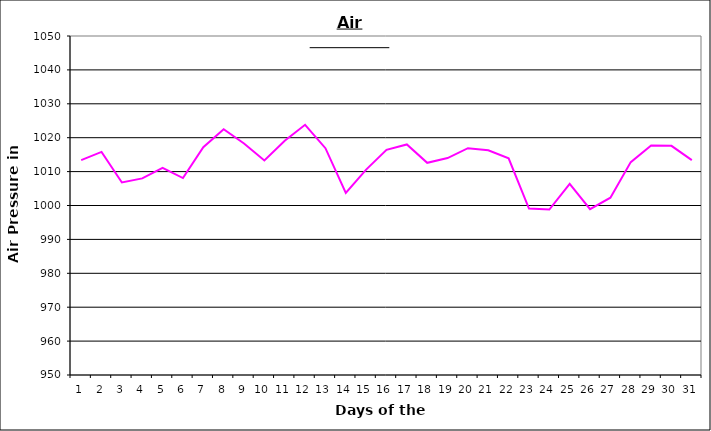
| Category | Series 0 |
|---|---|
| 0 | 1013.4 |
| 1 | 1015.8 |
| 2 | 1006.8 |
| 3 | 1008 |
| 4 | 1011.1 |
| 5 | 1008.1 |
| 6 | 1017.2 |
| 7 | 1022.5 |
| 8 | 1018.3 |
| 9 | 1013.3 |
| 10 | 1019.1 |
| 11 | 1023.8 |
| 12 | 1016.9 |
| 13 | 1003.7 |
| 14 | 1010.6 |
| 15 | 1016.4 |
| 16 | 1018 |
| 17 | 1012.6 |
| 18 | 1014 |
| 19 | 1016.9 |
| 20 | 1016.3 |
| 21 | 1013.9 |
| 22 | 999.1 |
| 23 | 998.8 |
| 24 | 1006.4 |
| 25 | 998.9 |
| 26 | 1002.3 |
| 27 | 1012.8 |
| 28 | 1017.7 |
| 29 | 1017.6 |
| 30 | 1013.4 |